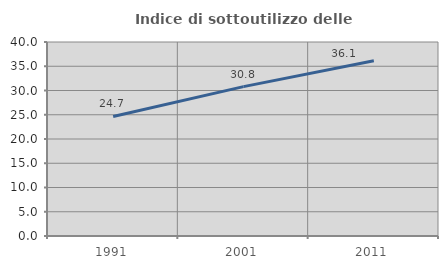
| Category | Indice di sottoutilizzo delle abitazioni  |
|---|---|
| 1991.0 | 24.655 |
| 2001.0 | 30.798 |
| 2011.0 | 36.127 |